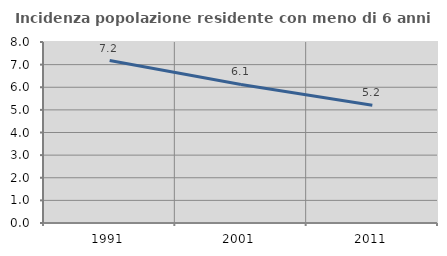
| Category | Incidenza popolazione residente con meno di 6 anni |
|---|---|
| 1991.0 | 7.179 |
| 2001.0 | 6.123 |
| 2011.0 | 5.204 |